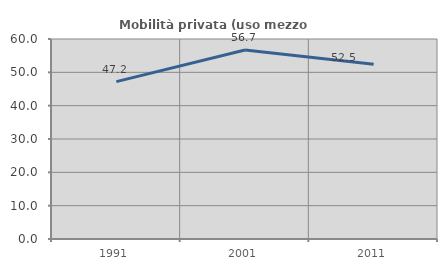
| Category | Mobilità privata (uso mezzo privato) |
|---|---|
| 1991.0 | 47.21 |
| 2001.0 | 56.71 |
| 2011.0 | 52.451 |